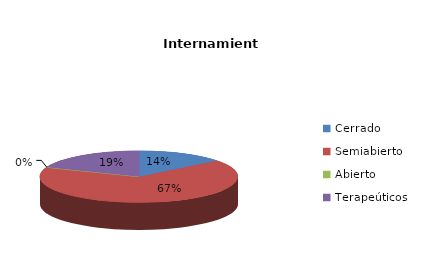
| Category | Series 0 |
|---|---|
| Cerrado | 3 |
| Semiabierto | 14 |
| Abierto | 0 |
| Terapeúticos | 4 |